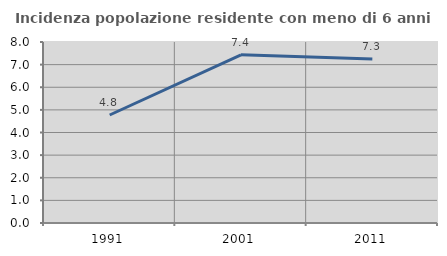
| Category | Incidenza popolazione residente con meno di 6 anni |
|---|---|
| 1991.0 | 4.773 |
| 2001.0 | 7.433 |
| 2011.0 | 7.25 |